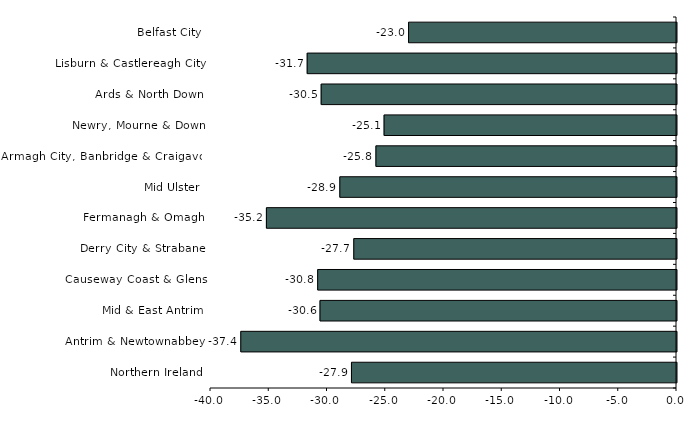
| Category | Series 0 |
|---|---|
| Belfast City | -23 |
| Lisburn & Castlereagh City | -31.7 |
| Ards & North Down | -30.5 |
| Newry, Mourne & Down | -25.1 |
| Armagh City, Banbridge & Craigavon | -25.8 |
| Mid Ulster | -28.9 |
| Fermanagh & Omagh | -35.2 |
| Derry City & Strabane | -27.7 |
| Causeway Coast & Glens | -30.8 |
| Mid & East Antrim | -30.6 |
| Antrim & Newtownabbey | -37.4 |
| Northern Ireland | -27.9 |